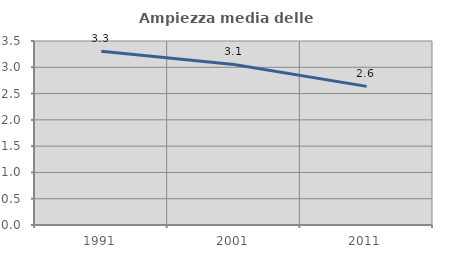
| Category | Ampiezza media delle famiglie |
|---|---|
| 1991.0 | 3.306 |
| 2001.0 | 3.055 |
| 2011.0 | 2.637 |